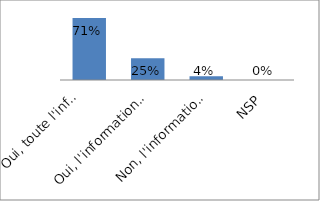
| Category | Series 0 |
|---|---|
| Oui, toute l'information est présentée_x000d_  | 0.708 |
| Oui, l'information est présentée | 0.25 |
| Non, l'information n'est pas présentée | 0.042 |
| NSP | 0 |